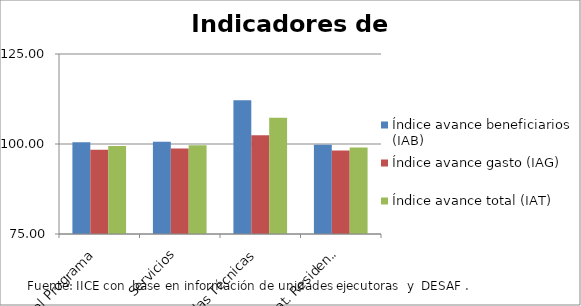
| Category | Índice avance beneficiarios (IAB)  | Índice avance gasto (IAG) | Índice avance total (IAT)  |
|---|---|---|---|
| Total Programa | 100.486 | 98.418 | 99.452 |
| Servicios | 100.611 | 98.745 | 99.678 |
| Ayudas Técnicas | 112.121 | 102.409 | 107.265 |
| Alternat. Residenciales | 99.824 | 98.173 | 98.999 |